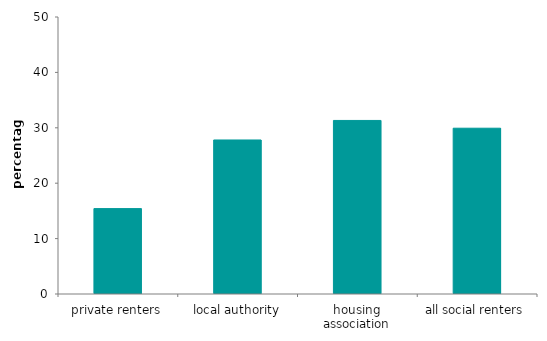
| Category | yes |
|---|---|
| private renters | 15.413 |
| local authority | 27.802 |
| housing association | 31.329 |
| all social renters | 29.924 |